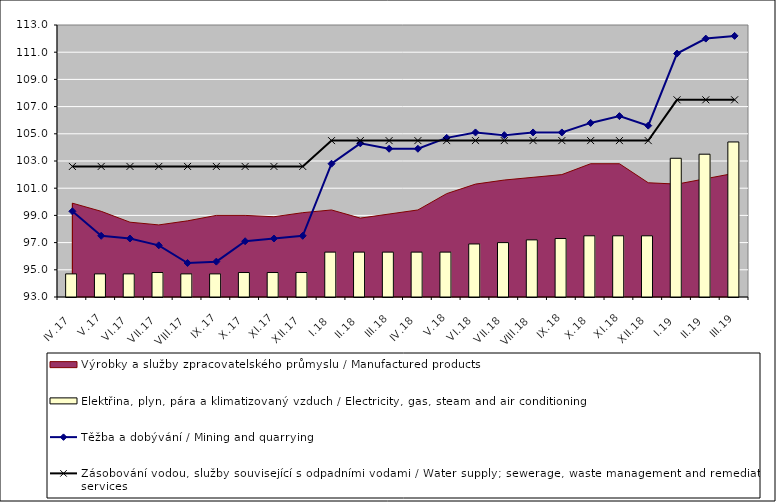
| Category | Elektřina, plyn, pára a klimatizovaný vzduch / Electricity, gas, steam and air conditioning |
|---|---|
| IV.17 | 94.7 |
| V.17 | 94.7 |
| VI.17 | 94.7 |
| VII.17 | 94.8 |
| VIII.17 | 94.7 |
| IX.17 | 94.7 |
| X.17 | 94.8 |
| XI.17 | 94.8 |
| XII.17 | 94.8 |
| I.18 | 96.3 |
| II.18 | 96.3 |
| III.18 | 96.3 |
| IV.18 | 96.3 |
| V.18 | 96.3 |
| VI.18 | 96.9 |
| VII.18 | 97 |
| VIII.18 | 97.2 |
| IX.18 | 97.3 |
| X.18 | 97.5 |
| XI.18 | 97.5 |
| XII.18 | 97.5 |
| I.19 | 103.2 |
| II.19 | 103.5 |
| III.19 | 104.4 |